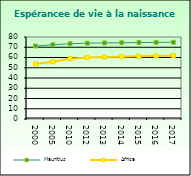
| Category | Mauritius | Africa                        |
|---|---|---|
| 2000.0 | 71.2 | 53.721 |
| 2005.0 | 72.446 | 55.757 |
| 2010.0 | 73.445 | 58.857 |
| 2012.0 | 73.965 | 59.91 |
| 2013.0 | 74.201 | 60.376 |
| 2014.0 | 74.411 | 60.801 |
| 2015.0 | 74.595 | 61.187 |
| 2016.0 | 74.758 | 61.538 |
| 2017.0 | 74.911 | 61.865 |